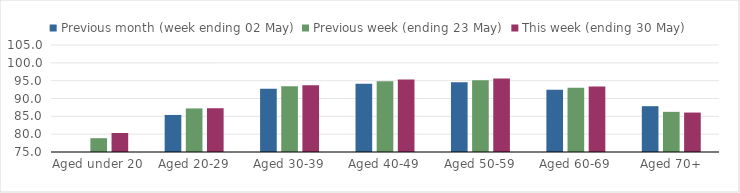
| Category | Previous month (week ending 02 May) | Previous week (ending 23 May) | This week (ending 30 May) |
|---|---|---|---|
| Aged under 20 | 74.732 | 78.87 | 80.32 |
| Aged 20-29 | 85.392 | 87.22 | 87.274 |
| Aged 30-39 | 92.705 | 93.463 | 93.735 |
| Aged 40-49 | 94.146 | 94.86 | 95.317 |
| Aged 50-59 | 94.578 | 95.145 | 95.627 |
| Aged 60-69 | 92.449 | 93.035 | 93.35 |
| Aged 70+ | 87.845 | 86.259 | 86.058 |